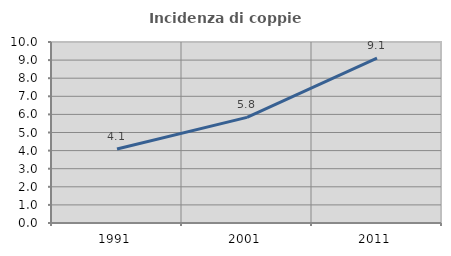
| Category | Incidenza di coppie miste |
|---|---|
| 1991.0 | 4.087 |
| 2001.0 | 5.838 |
| 2011.0 | 9.113 |